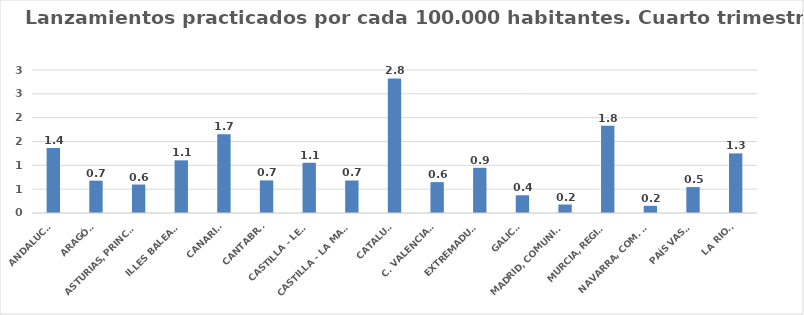
| Category | Series 0 |
|---|---|
| ANDALUCÍA | 1.361 |
| ARAGÓN | 0.679 |
| ASTURIAS, PRINCIPADO | 0.597 |
| ILLES BALEARS | 1.105 |
| CANARIAS | 1.653 |
| CANTABRIA | 0.683 |
| CASTILLA - LEÓN | 1.054 |
| CASTILLA - LA MANCHA | 0.682 |
| CATALUÑA | 2.823 |
| C. VALENCIANA | 0.647 |
| EXTREMADURA | 0.948 |
| GALICIA | 0.372 |
| MADRID, COMUNIDAD | 0.178 |
| MURCIA, REGIÓN | 1.828 |
| NAVARRA, COM. FORAL | 0.151 |
| PAÍS VASCO | 0.543 |
| LA RIOJA | 1.25 |